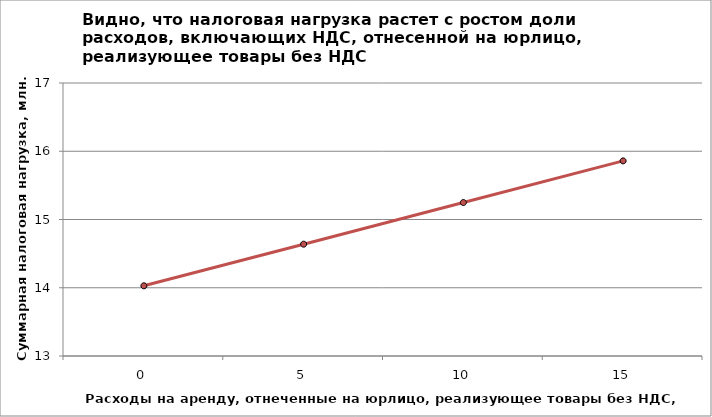
| Category | Налоговая нагрузка |
|---|---|
| 0.0 | 14.028 |
| 5.0 | 14.638 |
| 10.0 | 15.249 |
| 15.0 | 15.859 |